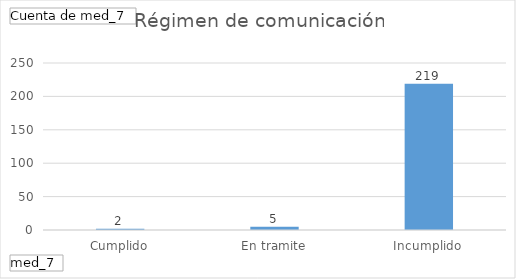
| Category | Total |
|---|---|
| Cumplido | 2 |
| En tramite | 5 |
| Incumplido | 219 |